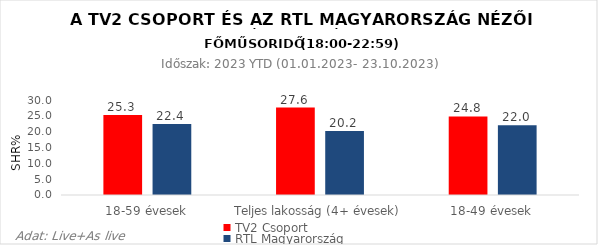
| Category | TV2 Csoport | RTL Magyarország |
|---|---|---|
| 18-59 évesek | 25.3 | 22.4 |
| Teljes lakosság (4+ évesek) | 27.6 | 20.2 |
| 18-49 évesek | 24.8 | 22 |